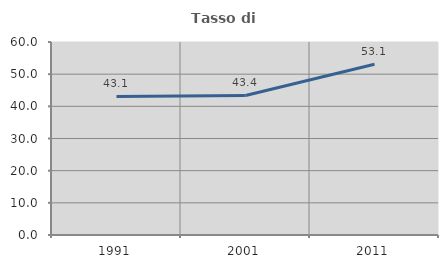
| Category | Tasso di occupazione   |
|---|---|
| 1991.0 | 43.062 |
| 2001.0 | 43.379 |
| 2011.0 | 53.061 |